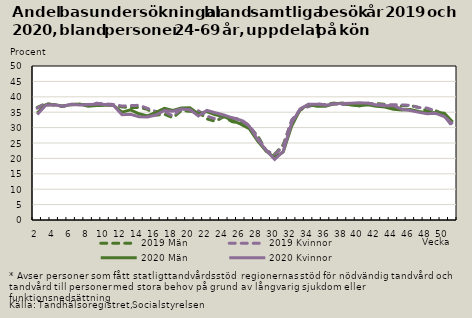
| Category | 2019 | 2020 |
|---|---|---|
| 2.0 | 36.286 | 34.262 |
| 3.0 | 37.831 | 37.286 |
| 4.0 | 37.352 | 37.38 |
| 5.0 | 36.95 | 36.936 |
| 6.0 | 37.382 | 37.55 |
| 7.0 | 37.526 | 37.341 |
| 8.0 | 37.47 | 37.401 |
| 9.0 | 37.904 | 37.626 |
| 10.0 | 37.697 | 37.505 |
| 11.0 | 37.512 | 37.174 |
| 12.0 | 36.994 | 34.146 |
| 13.0 | 37.152 | 34.331 |
| 14.0 | 37.241 | 33.55 |
| 15.0 | 36.246 | 33.425 |
| 16.0 | 35.209 | 34.067 |
| 17.0 | 35.244 | 35.557 |
| 18.0 | 33.752 | 35.311 |
| 19.0 | 36.092 | 36.026 |
| 20.0 | 35.741 | 35.865 |
| 21.0 | 35.443 | 33.792 |
| 22.0 | 33.745 | 35.589 |
| 23.0 | 32.817 | 34.807 |
| 24.0 | 33.766 | 34.116 |
| 25.0 | 33.163 | 33.165 |
| 26.0 | 32.665 | 32.406 |
| 27.0 | 30.701 | 30.516 |
| 28.0 | 26.888 | 26.071 |
| 29.0 | 22.544 | 22.627 |
| 30.0 | 21.231 | 19.68 |
| 31.0 | 23.851 | 22.238 |
| 32.0 | 32.452 | 31.501 |
| 33.0 | 35.764 | 36.047 |
| 34.0 | 36.827 | 37.617 |
| 35.0 | 37.779 | 37.582 |
| 36.0 | 37.352 | 37.298 |
| 37.0 | 37.675 | 37.731 |
| 38.0 | 37.478 | 37.79 |
| 39.0 | 37.558 | 37.929 |
| 40.0 | 37.291 | 38.096 |
| 41.0 | 37.95 | 37.914 |
| 42.0 | 37.566 | 37.33 |
| 43.0 | 37.37 | 37.064 |
| 44.0 | 37.448 | 37.138 |
| 45.0 | 37.386 | 35.961 |
| 46.0 | 37.23 | 35.579 |
| 47.0 | 36.514 | 34.942 |
| 48.0 | 36.326 | 34.465 |
| 49.0 | 35.333 | 34.655 |
| 50.0 | 33.801 | 33.589 |
| 51.0 | 30.208 | 31.11 |